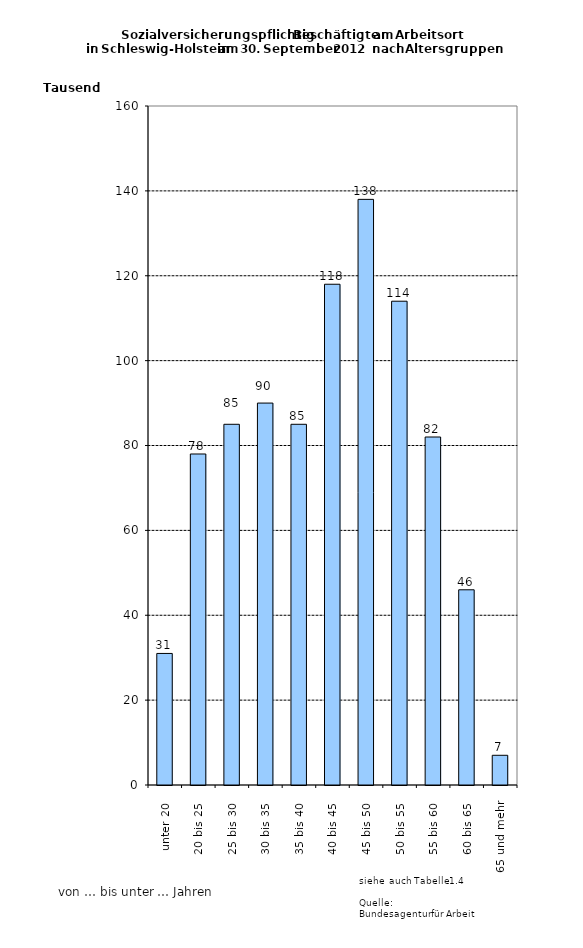
| Category | Series 0 |
|---|---|
| unter 20 | 31000 |
| 20 bis 25 | 78000 |
| 25 bis 30 | 85000 |
| 30 bis 35 | 90000 |
| 35 bis 40 | 85000 |
| 40 bis 45 | 118000 |
| 45 bis 50 | 138000 |
| 50 bis 55 | 114000 |
| 55 bis 60 | 82000 |
| 60 bis 65 | 46000 |
| 65 und mehr | 7000 |